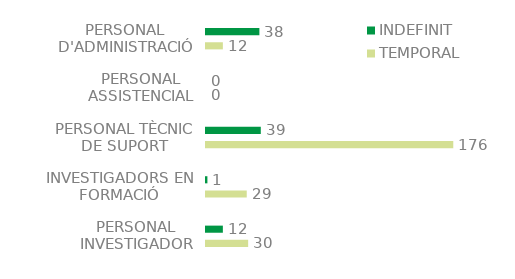
| Category | TEMPORAL | INDEFINIT |
|---|---|---|
| PERSONAL INVESTIGADOR | 30 | 12 |
| INVESTIGADORS EN FORMACIÓ | 29 | 1 |
| PERSONAL TÈCNIC DE SUPORT | 176 | 39 |
| PERSONAL ASSISTENCIAL | 0 | 0 |
| PERSONAL D'ADMINISTRACIÓ | 12 | 38 |